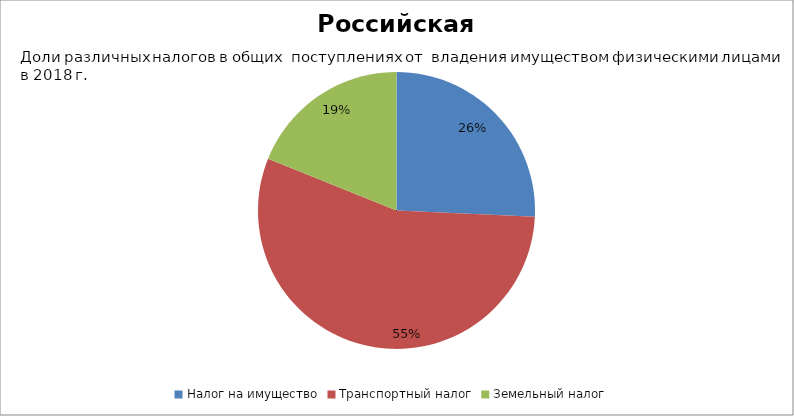
| Category | Российская Федерация |
|---|---|
| Налог на имущество  | 61344302181.1 |
| Транспортный налог  | 132048227811.4 |
| Земельный налог  | 45060316960.59 |